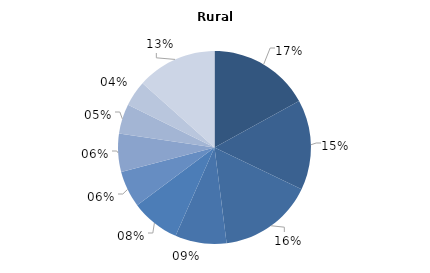
| Category | Series 0 |
|---|---|
| Tumori  | 0.17 |
| Boli ale aparatului circulator | 0.151 |
| Boli ale sistemului osteo-articular, ale muşchilor şi ţesutului conjunctiv | 0.159 |
| Boli ale sistemului nervos | 0.086 |
| Tulburări mentale şi de comportament | 0.082 |
| Boli endocrine, de nutriție și metabolism | 0.061 |
| Leziuni traumatice  | 0.064 |
| Boli ale aparatului digestiv | 0.05 |
| Tuberculoză | 0.043 |
| Alte boli | 0.134 |